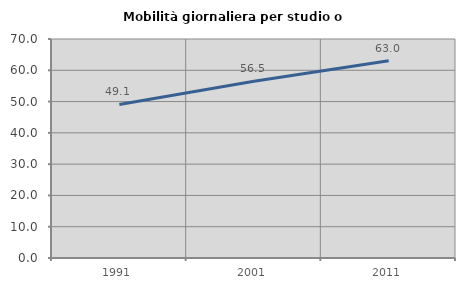
| Category | Mobilità giornaliera per studio o lavoro |
|---|---|
| 1991.0 | 49.074 |
| 2001.0 | 56.489 |
| 2011.0 | 63.047 |